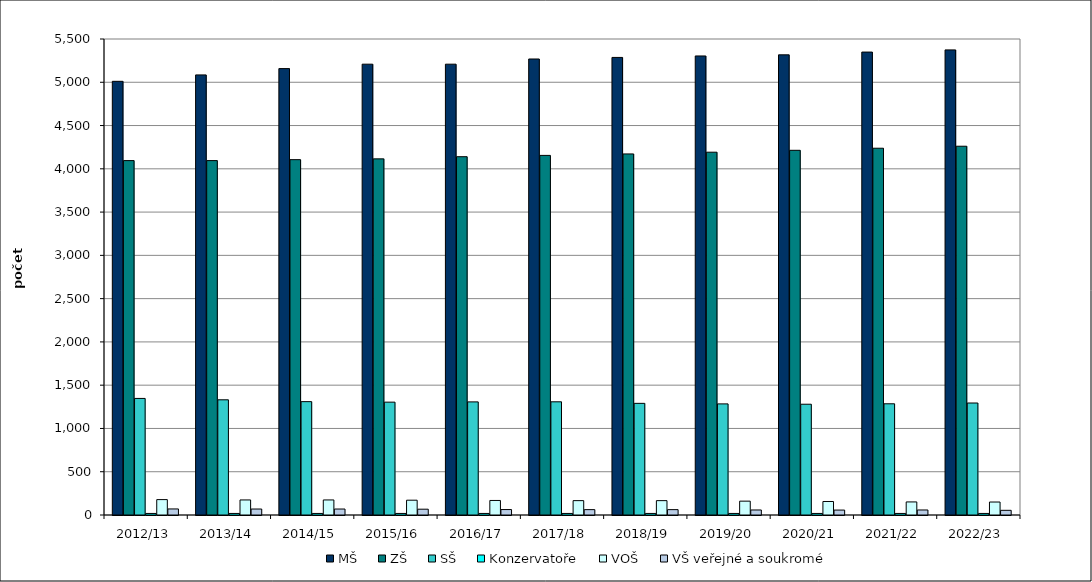
| Category | MŠ | ZŠ | SŠ | Konzervatoře | VOŠ | VŠ veřejné a soukromé |
|---|---|---|---|---|---|---|
| 2012/13 | 5011 | 4095 | 1347 | 18 | 178 | 70 |
| 2013/14 | 5085 | 4095 | 1331 | 18 | 174 | 69 |
| 2014/15 | 5158 | 4106 | 1310 | 18 | 174 | 69 |
| 2015/16 | 5209 | 4115 | 1304 | 18 | 171 | 67 |
| 2016/17 | 5209 | 4140 | 1307 | 18 | 168 | 63 |
| 2017/18 | 5269 | 4155 | 1308 | 18 | 166 | 62 |
| 2018/19 | 5287 | 4172 | 1290 | 18 | 166 | 62 |
| 2019/20 | 5304 | 4192 | 1284 | 18 | 160 | 58 |
| 2020/21 | 5317 | 4214 | 1280 | 18 | 156 | 57 |
| 2021/22 | 5349 | 4238 | 1285 | 18 | 151 | 58 |
| 2022/23 | 5374 | 4261 | 1294 | 18 | 150 | 54 |